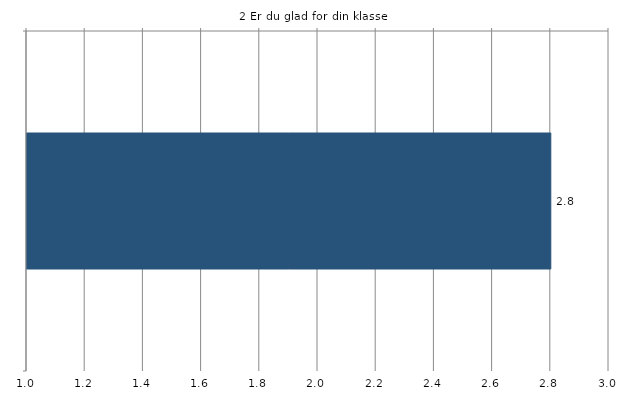
| Category | Gns. |
|---|---|
|   | 2.8 |